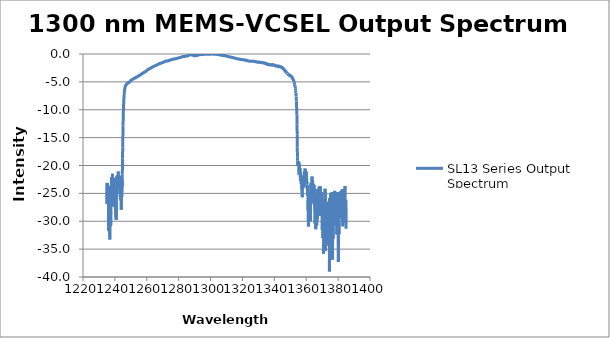
| Category | SL13 Series Output Spectrum |
|---|---|
| 1235.017822 | -23.178 |
| 1235.092651 | -26.92 |
| 1235.167358 | -23.479 |
| 1235.242065 | -23.117 |
| 1235.316772 | -26.883 |
| 1235.391602 | -23.198 |
| 1235.466309 | -24.905 |
| 1235.541138 | -24.521 |
| 1235.615967 | -25.759 |
| 1235.690796 | -24.317 |
| 1235.765625 | -24.794 |
| 1235.840454 | -24.998 |
| 1235.915283 | -25.098 |
| 1235.990112 | -25.63 |
| 1236.064941 | -31.709 |
| 1236.139771 | -23.677 |
| 1236.2146 | -27.805 |
| 1236.289429 | -25.815 |
| 1236.36438 | -25.772 |
| 1236.439209 | -25.107 |
| 1236.51416 | -25.187 |
| 1236.588989 | -23.827 |
| 1236.66394 | -25.55 |
| 1236.738892 | -25.992 |
| 1236.813843 | -33.268 |
| 1236.888794 | -25.245 |
| 1236.963745 | -24.883 |
| 1237.038696 | -27.538 |
| 1237.113647 | -23.63 |
| 1237.188721 | -29.483 |
| 1237.263672 | -30.914 |
| 1237.338623 | -26.489 |
| 1237.413696 | -30.67 |
| 1237.488647 | -25.498 |
| 1237.563721 | -27.207 |
| 1237.638794 | -26.888 |
| 1237.713745 | -27.307 |
| 1237.788818 | -25.378 |
| 1237.863892 | -25.714 |
| 1237.938965 | -22.08 |
| 1238.014038 | -25.544 |
| 1238.089111 | -26.344 |
| 1238.164185 | -25.006 |
| 1238.23938 | -22.156 |
| 1238.314453 | -24.307 |
| 1238.389526 | -23.302 |
| 1238.464722 | -24.922 |
| 1238.539795 | -21.475 |
| 1238.61499 | -24.49 |
| 1238.690186 | -23.038 |
| 1238.765381 | -22.666 |
| 1238.840576 | -24.753 |
| 1238.915771 | -23.71 |
| 1238.990967 | -25.703 |
| 1239.066162 | -22.613 |
| 1239.141357 | -22.245 |
| 1239.216553 | -27.415 |
| 1239.29187 | -26.958 |
| 1239.367065 | -23.717 |
| 1239.442261 | -26.08 |
| 1239.517578 | -25.221 |
| 1239.592896 | -24.454 |
| 1239.668091 | -24.895 |
| 1239.743408 | -25.11 |
| 1239.818726 | -25.185 |
| 1239.894043 | -26.1 |
| 1239.96936 | -24.505 |
| 1240.044678 | -25.858 |
| 1240.119995 | -24.098 |
| 1240.195313 | -25.616 |
| 1240.27063 | -23.873 |
| 1240.346069 | -27.184 |
| 1240.421509 | -28.304 |
| 1240.496826 | -25.278 |
| 1240.572266 | -25.849 |
| 1240.647705 | -29.289 |
| 1240.723022 | -23.726 |
| 1240.798462 | -29.763 |
| 1240.873901 | -23.878 |
| 1240.949341 | -25.069 |
| 1241.02478 | -24.898 |
| 1241.10022 | -24.834 |
| 1241.175659 | -21.917 |
| 1241.251221 | -25.121 |
| 1241.32666 | -23.162 |
| 1241.4021 | -23.84 |
| 1241.477661 | -22.129 |
| 1241.553101 | -23.209 |
| 1241.628662 | -23.309 |
| 1241.704224 | -22.901 |
| 1241.779663 | -22.162 |
| 1241.855225 | -21.719 |
| 1241.930908 | -21.714 |
| 1242.00647 | -24.059 |
| 1242.082031 | -21.068 |
| 1242.157593 | -21.642 |
| 1242.233154 | -22.555 |
| 1242.308838 | -22.256 |
| 1242.384399 | -21.975 |
| 1242.459961 | -23.236 |
| 1242.535645 | -22.601 |
| 1242.611328 | -22.903 |
| 1242.68689 | -24.285 |
| 1242.762573 | -23.297 |
| 1242.838257 | -21.834 |
| 1242.91394 | -23.138 |
| 1242.989624 | -23.001 |
| 1243.065308 | -23.47 |
| 1243.140991 | -24.163 |
| 1243.216675 | -23.33 |
| 1243.29248 | -22.642 |
| 1243.368164 | -25.693 |
| 1243.44397 | -24.565 |
| 1243.519653 | -23.768 |
| 1243.595459 | -23.18 |
| 1243.671265 | -24.682 |
| 1243.746948 | -26.228 |
| 1243.822754 | -24.622 |
| 1243.89856 | -24.351 |
| 1243.974365 | -27.939 |
| 1244.050171 | -24.407 |
| 1244.125977 | -24.814 |
| 1244.201904 | -24.524 |
| 1244.27771 | -22.801 |
| 1244.353516 | -25.668 |
| 1244.429443 | -23.31 |
| 1244.505249 | -22.739 |
| 1244.581177 | -23.643 |
| 1244.656982 | -21.614 |
| 1244.73291 | -20.265 |
| 1244.808838 | -18.7 |
| 1244.884766 | -16.748 |
| 1244.960693 | -15.62 |
| 1245.036621 | -14.154 |
| 1245.112549 | -12.785 |
| 1245.188599 | -11.843 |
| 1245.264526 | -10.874 |
| 1245.340454 | -10.115 |
| 1245.416504 | -9.482 |
| 1245.492432 | -8.901 |
| 1245.568481 | -8.468 |
| 1245.644409 | -8.011 |
| 1245.720459 | -7.636 |
| 1245.796509 | -7.364 |
| 1245.872559 | -7.061 |
| 1245.948608 | -6.841 |
| 1246.024658 | -6.607 |
| 1246.100708 | -6.442 |
| 1246.176758 | -6.315 |
| 1246.252808 | -6.147 |
| 1246.328979 | -6.063 |
| 1246.405029 | -5.945 |
| 1246.481079 | -5.882 |
| 1246.557251 | -5.786 |
| 1246.633423 | -5.77 |
| 1246.709595 | -5.658 |
| 1246.785767 | -5.636 |
| 1246.861938 | -5.591 |
| 1246.937988 | -5.575 |
| 1247.014282 | -5.588 |
| 1247.090454 | -5.556 |
| 1247.166626 | -5.474 |
| 1247.242798 | -5.465 |
| 1247.31897 | -5.416 |
| 1247.395264 | -5.447 |
| 1247.471436 | -5.332 |
| 1247.547729 | -5.315 |
| 1247.623901 | -5.32 |
| 1247.700195 | -5.256 |
| 1247.776489 | -5.276 |
| 1247.852783 | -5.245 |
| 1247.929077 | -5.193 |
| 1248.005371 | -5.249 |
| 1248.081665 | -5.161 |
| 1248.157959 | -5.198 |
| 1248.234375 | -5.17 |
| 1248.310669 | -5.2 |
| 1248.386963 | -5.191 |
| 1248.463379 | -5.163 |
| 1248.539673 | -5.172 |
| 1248.616089 | -5.167 |
| 1248.692505 | -5.151 |
| 1248.768799 | -5.171 |
| 1248.845215 | -5.118 |
| 1248.921631 | -5.114 |
| 1248.998047 | -5.066 |
| 1249.074463 | -5.076 |
| 1249.150879 | -5.024 |
| 1249.227417 | -5.021 |
| 1249.303833 | -4.966 |
| 1249.380249 | -4.931 |
| 1249.456787 | -4.943 |
| 1249.533203 | -4.909 |
| 1249.609741 | -4.856 |
| 1249.686279 | -4.853 |
| 1249.762695 | -4.793 |
| 1249.839355 | -4.789 |
| 1249.915894 | -4.726 |
| 1249.992432 | -4.739 |
| 1250.06897 | -4.737 |
| 1250.145508 | -4.714 |
| 1250.222046 | -4.744 |
| 1250.298706 | -4.703 |
| 1250.375244 | -4.729 |
| 1250.451782 | -4.702 |
| 1250.528442 | -4.665 |
| 1250.605103 | -4.654 |
| 1250.681641 | -4.61 |
| 1250.758301 | -4.626 |
| 1250.834961 | -4.591 |
| 1250.911621 | -4.554 |
| 1250.988281 | -4.575 |
| 1251.064941 | -4.55 |
| 1251.141602 | -4.555 |
| 1251.218262 | -4.496 |
| 1251.294922 | -4.487 |
| 1251.371704 | -4.471 |
| 1251.448486 | -4.445 |
| 1251.525146 | -4.437 |
| 1251.601929 | -4.421 |
| 1251.678711 | -4.414 |
| 1251.755493 | -4.42 |
| 1251.832153 | -4.38 |
| 1251.908936 | -4.407 |
| 1251.985718 | -4.39 |
| 1252.0625 | -4.389 |
| 1252.139282 | -4.362 |
| 1252.216187 | -4.349 |
| 1252.292969 | -4.37 |
| 1252.369751 | -4.333 |
| 1252.446655 | -4.359 |
| 1252.523438 | -4.325 |
| 1252.600342 | -4.302 |
| 1252.677246 | -4.321 |
| 1252.754028 | -4.264 |
| 1252.830933 | -4.292 |
| 1252.907837 | -4.251 |
| 1252.984863 | -4.226 |
| 1253.061768 | -4.197 |
| 1253.138672 | -4.174 |
| 1253.215576 | -4.191 |
| 1253.292603 | -4.146 |
| 1253.369507 | -4.155 |
| 1253.446411 | -4.185 |
| 1253.523438 | -4.135 |
| 1253.600464 | -4.156 |
| 1253.677368 | -4.123 |
| 1253.754395 | -4.128 |
| 1253.831421 | -4.11 |
| 1253.908447 | -4.088 |
| 1253.985474 | -4.095 |
| 1254.0625 | -4.064 |
| 1254.139526 | -4.066 |
| 1254.216553 | -4.074 |
| 1254.293701 | -4.035 |
| 1254.370728 | -4.057 |
| 1254.447876 | -4.036 |
| 1254.524902 | -4.001 |
| 1254.602051 | -3.956 |
| 1254.679199 | -3.972 |
| 1254.756348 | -3.928 |
| 1254.833496 | -3.92 |
| 1254.910645 | -3.918 |
| 1254.987793 | -3.882 |
| 1255.064941 | -3.894 |
| 1255.14209 | -3.895 |
| 1255.219238 | -3.838 |
| 1255.296509 | -3.883 |
| 1255.373657 | -3.817 |
| 1255.450806 | -3.837 |
| 1255.528076 | -3.807 |
| 1255.605347 | -3.796 |
| 1255.682495 | -3.81 |
| 1255.759766 | -3.787 |
| 1255.837036 | -3.791 |
| 1255.914307 | -3.79 |
| 1255.991577 | -3.739 |
| 1256.068848 | -3.758 |
| 1256.146118 | -3.721 |
| 1256.223511 | -3.72 |
| 1256.300781 | -3.686 |
| 1256.378174 | -3.647 |
| 1256.455444 | -3.628 |
| 1256.532837 | -3.626 |
| 1256.610229 | -3.618 |
| 1256.6875 | -3.582 |
| 1256.764893 | -3.586 |
| 1256.842285 | -3.581 |
| 1256.919678 | -3.553 |
| 1256.99707 | -3.526 |
| 1257.074463 | -3.496 |
| 1257.151855 | -3.495 |
| 1257.22937 | -3.48 |
| 1257.306763 | -3.465 |
| 1257.384155 | -3.478 |
| 1257.46167 | -3.447 |
| 1257.539185 | -3.467 |
| 1257.616577 | -3.429 |
| 1257.694092 | -3.407 |
| 1257.771606 | -3.415 |
| 1257.849121 | -3.373 |
| 1257.926636 | -3.376 |
| 1258.00415 | -3.329 |
| 1258.081665 | -3.334 |
| 1258.159302 | -3.349 |
| 1258.236816 | -3.306 |
| 1258.314331 | -3.316 |
| 1258.391968 | -3.272 |
| 1258.469482 | -3.279 |
| 1258.547119 | -3.264 |
| 1258.624756 | -3.247 |
| 1258.702271 | -3.239 |
| 1258.779907 | -3.201 |
| 1258.857544 | -3.174 |
| 1258.935181 | -3.187 |
| 1259.012817 | -3.168 |
| 1259.090454 | -3.197 |
| 1259.168213 | -3.146 |
| 1259.24585 | -3.16 |
| 1259.323486 | -3.14 |
| 1259.401245 | -3.13 |
| 1259.479004 | -3.096 |
| 1259.556763 | -3.067 |
| 1259.634399 | -3.057 |
| 1259.712158 | -3.032 |
| 1259.789917 | -3.007 |
| 1259.867676 | -3.01 |
| 1259.945435 | -2.967 |
| 1260.023193 | -2.971 |
| 1260.100952 | -2.926 |
| 1260.178711 | -2.917 |
| 1260.256592 | -2.894 |
| 1260.334351 | -2.882 |
| 1260.412231 | -2.856 |
| 1260.48999 | -2.828 |
| 1260.567871 | -2.835 |
| 1260.645752 | -2.816 |
| 1260.723511 | -2.798 |
| 1260.801392 | -2.825 |
| 1260.879272 | -2.782 |
| 1260.957153 | -2.778 |
| 1261.035156 | -2.732 |
| 1261.113037 | -2.717 |
| 1261.19104 | -2.708 |
| 1261.268921 | -2.686 |
| 1261.346802 | -2.696 |
| 1261.424805 | -2.662 |
| 1261.502686 | -2.668 |
| 1261.580688 | -2.687 |
| 1261.658691 | -2.626 |
| 1261.736694 | -2.656 |
| 1261.814697 | -2.611 |
| 1261.8927 | -2.599 |
| 1261.970703 | -2.596 |
| 1262.048706 | -2.577 |
| 1262.126709 | -2.561 |
| 1262.204712 | -2.552 |
| 1262.282837 | -2.555 |
| 1262.36084 | -2.544 |
| 1262.438965 | -2.53 |
| 1262.516968 | -2.515 |
| 1262.595093 | -2.499 |
| 1262.673218 | -2.513 |
| 1262.751343 | -2.473 |
| 1262.829468 | -2.464 |
| 1262.907593 | -2.446 |
| 1262.985718 | -2.426 |
| 1263.063965 | -2.447 |
| 1263.14209 | -2.409 |
| 1263.220215 | -2.419 |
| 1263.298462 | -2.423 |
| 1263.376587 | -2.389 |
| 1263.454834 | -2.389 |
| 1263.532959 | -2.335 |
| 1263.611206 | -2.348 |
| 1263.689453 | -2.341 |
| 1263.7677 | -2.314 |
| 1263.845947 | -2.301 |
| 1263.924194 | -2.272 |
| 1264.002441 | -2.297 |
| 1264.080688 | -2.275 |
| 1264.158936 | -2.261 |
| 1264.237305 | -2.251 |
| 1264.315674 | -2.22 |
| 1264.393921 | -2.22 |
| 1264.47229 | -2.195 |
| 1264.550659 | -2.179 |
| 1264.628906 | -2.18 |
| 1264.707275 | -2.169 |
| 1264.785645 | -2.167 |
| 1264.864014 | -2.167 |
| 1264.942383 | -2.166 |
| 1265.020752 | -2.135 |
| 1265.099243 | -2.129 |
| 1265.177612 | -2.107 |
| 1265.255981 | -2.093 |
| 1265.334473 | -2.091 |
| 1265.412842 | -2.067 |
| 1265.491333 | -2.059 |
| 1265.569824 | -2.079 |
| 1265.648315 | -2.034 |
| 1265.726685 | -2.062 |
| 1265.805176 | -2.028 |
| 1265.883789 | -2.007 |
| 1265.96228 | -1.997 |
| 1266.040771 | -1.981 |
| 1266.119385 | -1.991 |
| 1266.197876 | -1.982 |
| 1266.276367 | -1.969 |
| 1266.35498 | -1.97 |
| 1266.433594 | -1.948 |
| 1266.512085 | -1.961 |
| 1266.590698 | -1.943 |
| 1266.669312 | -1.935 |
| 1266.747925 | -1.907 |
| 1266.826538 | -1.907 |
| 1266.905151 | -1.88 |
| 1266.983765 | -1.859 |
| 1267.062378 | -1.86 |
| 1267.141113 | -1.842 |
| 1267.219727 | -1.828 |
| 1267.29834 | -1.843 |
| 1267.377075 | -1.804 |
| 1267.455811 | -1.817 |
| 1267.534546 | -1.783 |
| 1267.613281 | -1.764 |
| 1267.692017 | -1.751 |
| 1267.770752 | -1.747 |
| 1267.849487 | -1.743 |
| 1267.928223 | -1.721 |
| 1268.006958 | -1.722 |
| 1268.085693 | -1.722 |
| 1268.164551 | -1.714 |
| 1268.243286 | -1.726 |
| 1268.322021 | -1.691 |
| 1268.400879 | -1.711 |
| 1268.479736 | -1.675 |
| 1268.558594 | -1.669 |
| 1268.637329 | -1.664 |
| 1268.716187 | -1.66 |
| 1268.795044 | -1.669 |
| 1268.873901 | -1.643 |
| 1268.952881 | -1.632 |
| 1269.031738 | -1.628 |
| 1269.110596 | -1.611 |
| 1269.189575 | -1.609 |
| 1269.268555 | -1.588 |
| 1269.347412 | -1.58 |
| 1269.426392 | -1.564 |
| 1269.505371 | -1.563 |
| 1269.584229 | -1.583 |
| 1269.663208 | -1.568 |
| 1269.742188 | -1.572 |
| 1269.821167 | -1.549 |
| 1269.900146 | -1.537 |
| 1269.979248 | -1.543 |
| 1270.058228 | -1.517 |
| 1270.137207 | -1.521 |
| 1270.216309 | -1.496 |
| 1270.295288 | -1.487 |
| 1270.37439 | -1.468 |
| 1270.453369 | -1.454 |
| 1270.532471 | -1.467 |
| 1270.611572 | -1.451 |
| 1270.690674 | -1.451 |
| 1270.769775 | -1.413 |
| 1270.848999 | -1.412 |
| 1270.928101 | -1.409 |
| 1271.007202 | -1.374 |
| 1271.086426 | -1.381 |
| 1271.165527 | -1.361 |
| 1271.244629 | -1.355 |
| 1271.323853 | -1.38 |
| 1271.403076 | -1.339 |
| 1271.482178 | -1.351 |
| 1271.561401 | -1.34 |
| 1271.640625 | -1.33 |
| 1271.719849 | -1.323 |
| 1271.799072 | -1.301 |
| 1271.878296 | -1.304 |
| 1271.957642 | -1.298 |
| 1272.036865 | -1.284 |
| 1272.116089 | -1.313 |
| 1272.195435 | -1.273 |
| 1272.274658 | -1.28 |
| 1272.354004 | -1.256 |
| 1272.43335 | -1.273 |
| 1272.512695 | -1.252 |
| 1272.592041 | -1.25 |
| 1272.671387 | -1.228 |
| 1272.750732 | -1.239 |
| 1272.830078 | -1.243 |
| 1272.909424 | -1.242 |
| 1272.98877 | -1.233 |
| 1273.068237 | -1.25 |
| 1273.147583 | -1.232 |
| 1273.227051 | -1.248 |
| 1273.306396 | -1.218 |
| 1273.385864 | -1.233 |
| 1273.465332 | -1.216 |
| 1273.5448 | -1.209 |
| 1273.624268 | -1.212 |
| 1273.703735 | -1.187 |
| 1273.783203 | -1.198 |
| 1273.862671 | -1.198 |
| 1273.942139 | -1.146 |
| 1274.021606 | -1.173 |
| 1274.101196 | -1.146 |
| 1274.180786 | -1.156 |
| 1274.260376 | -1.14 |
| 1274.339844 | -1.126 |
| 1274.419434 | -1.117 |
| 1274.499023 | -1.101 |
| 1274.578613 | -1.107 |
| 1274.658203 | -1.098 |
| 1274.737793 | -1.093 |
| 1274.817383 | -1.088 |
| 1274.896973 | -1.066 |
| 1274.976563 | -1.075 |
| 1275.056274 | -1.052 |
| 1275.135864 | -1.049 |
| 1275.215576 | -1.025 |
| 1275.295166 | -1.02 |
| 1275.374878 | -1.019 |
| 1275.45459 | -1.002 |
| 1275.534302 | -1.002 |
| 1275.614014 | -0.994 |
| 1275.693726 | -0.977 |
| 1275.77356 | -0.976 |
| 1275.853271 | -0.959 |
| 1275.932983 | -0.958 |
| 1276.012695 | -0.963 |
| 1276.092529 | -0.936 |
| 1276.172241 | -0.964 |
| 1276.252075 | -0.931 |
| 1276.331909 | -0.953 |
| 1276.411743 | -0.936 |
| 1276.491455 | -0.941 |
| 1276.571289 | -0.942 |
| 1276.651123 | -0.932 |
| 1276.730957 | -0.928 |
| 1276.810913 | -0.922 |
| 1276.890747 | -0.92 |
| 1276.970581 | -0.92 |
| 1277.050537 | -0.891 |
| 1277.130371 | -0.901 |
| 1277.210327 | -0.892 |
| 1277.290283 | -0.902 |
| 1277.370117 | -0.877 |
| 1277.450195 | -0.87 |
| 1277.530151 | -0.868 |
| 1277.610107 | -0.853 |
| 1277.690063 | -0.868 |
| 1277.77002 | -0.857 |
| 1277.849976 | -0.844 |
| 1277.930054 | -0.856 |
| 1278.01001 | -0.832 |
| 1278.089966 | -0.854 |
| 1278.170044 | -0.841 |
| 1278.250122 | -0.844 |
| 1278.330078 | -0.823 |
| 1278.410156 | -0.812 |
| 1278.490234 | -0.817 |
| 1278.570313 | -0.794 |
| 1278.650391 | -0.803 |
| 1278.730469 | -0.791 |
| 1278.810669 | -0.775 |
| 1278.890747 | -0.793 |
| 1278.970825 | -0.762 |
| 1279.051025 | -0.79 |
| 1279.131226 | -0.768 |
| 1279.211426 | -0.766 |
| 1279.291504 | -0.754 |
| 1279.371704 | -0.741 |
| 1279.451904 | -0.749 |
| 1279.532104 | -0.74 |
| 1279.612305 | -0.719 |
| 1279.692505 | -0.738 |
| 1279.772827 | -0.718 |
| 1279.853027 | -0.724 |
| 1279.933228 | -0.71 |
| 1280.01355 | -0.701 |
| 1280.09375 | -0.706 |
| 1280.174072 | -0.69 |
| 1280.254395 | -0.696 |
| 1280.334595 | -0.672 |
| 1280.414917 | -0.669 |
| 1280.495239 | -0.666 |
| 1280.575562 | -0.64 |
| 1280.655884 | -0.658 |
| 1280.736328 | -0.638 |
| 1280.816772 | -0.64 |
| 1280.897095 | -0.623 |
| 1280.977417 | -0.617 |
| 1281.057861 | -0.608 |
| 1281.138306 | -0.597 |
| 1281.218628 | -0.604 |
| 1281.299072 | -0.582 |
| 1281.379517 | -0.581 |
| 1281.459961 | -0.581 |
| 1281.540405 | -0.565 |
| 1281.62085 | -0.577 |
| 1281.701294 | -0.552 |
| 1281.78186 | -0.549 |
| 1281.862305 | -0.537 |
| 1281.942749 | -0.512 |
| 1282.023315 | -0.519 |
| 1282.103882 | -0.501 |
| 1282.184326 | -0.498 |
| 1282.264893 | -0.508 |
| 1282.345459 | -0.489 |
| 1282.426147 | -0.501 |
| 1282.506714 | -0.468 |
| 1282.58728 | -0.485 |
| 1282.667847 | -0.478 |
| 1282.748413 | -0.467 |
| 1282.829102 | -0.469 |
| 1282.909668 | -0.445 |
| 1282.990356 | -0.457 |
| 1283.070923 | -0.449 |
| 1283.151611 | -0.454 |
| 1283.2323 | -0.45 |
| 1283.312988 | -0.449 |
| 1283.393677 | -0.45 |
| 1283.474365 | -0.43 |
| 1283.555054 | -0.439 |
| 1283.635742 | -0.43 |
| 1283.716431 | -0.428 |
| 1283.797241 | -0.428 |
| 1283.87793 | -0.414 |
| 1283.958618 | -0.423 |
| 1284.039429 | -0.422 |
| 1284.120239 | -0.414 |
| 1284.20105 | -0.427 |
| 1284.28186 | -0.409 |
| 1284.362671 | -0.42 |
| 1284.443481 | -0.399 |
| 1284.524292 | -0.392 |
| 1284.605103 | -0.412 |
| 1284.686035 | -0.386 |
| 1284.766846 | -0.397 |
| 1284.847656 | -0.381 |
| 1284.928589 | -0.387 |
| 1285.009521 | -0.395 |
| 1285.090332 | -0.383 |
| 1285.171265 | -0.369 |
| 1285.252197 | -0.349 |
| 1285.33313 | -0.346 |
| 1285.414063 | -0.338 |
| 1285.494995 | -0.322 |
| 1285.575928 | -0.334 |
| 1285.656982 | -0.31 |
| 1285.738037 | -0.31 |
| 1285.81897 | -0.307 |
| 1285.900024 | -0.306 |
| 1285.980957 | -0.28 |
| 1286.062012 | -0.275 |
| 1286.143066 | -0.253 |
| 1286.224121 | -0.248 |
| 1286.305054 | -0.24 |
| 1286.38623 | -0.242 |
| 1286.467285 | -0.221 |
| 1286.54834 | -0.227 |
| 1286.629395 | -0.2 |
| 1286.710449 | -0.21 |
| 1286.791626 | -0.195 |
| 1286.872681 | -0.192 |
| 1286.953857 | -0.188 |
| 1287.035034 | -0.149 |
| 1287.116211 | -0.152 |
| 1287.197266 | -0.156 |
| 1287.278442 | -0.147 |
| 1287.359619 | -0.163 |
| 1287.440918 | -0.144 |
| 1287.522095 | -0.162 |
| 1287.603394 | -0.148 |
| 1287.68457 | -0.155 |
| 1287.765869 | -0.147 |
| 1287.847046 | -0.153 |
| 1287.928345 | -0.153 |
| 1288.009521 | -0.146 |
| 1288.09082 | -0.15 |
| 1288.172119 | -0.164 |
| 1288.253418 | -0.165 |
| 1288.334717 | -0.187 |
| 1288.416016 | -0.19 |
| 1288.497437 | -0.193 |
| 1288.578735 | -0.203 |
| 1288.660034 | -0.19 |
| 1288.741455 | -0.209 |
| 1288.822754 | -0.207 |
| 1288.904175 | -0.214 |
| 1288.985596 | -0.219 |
| 1289.066895 | -0.234 |
| 1289.148438 | -0.248 |
| 1289.229858 | -0.255 |
| 1289.311279 | -0.275 |
| 1289.3927 | -0.256 |
| 1289.474121 | -0.272 |
| 1289.555664 | -0.273 |
| 1289.637085 | -0.261 |
| 1289.718628 | -0.288 |
| 1289.800049 | -0.284 |
| 1289.881592 | -0.304 |
| 1289.963013 | -0.312 |
| 1290.044556 | -0.309 |
| 1290.126099 | -0.316 |
| 1290.207642 | -0.31 |
| 1290.289185 | -0.303 |
| 1290.370728 | -0.311 |
| 1290.452393 | -0.297 |
| 1290.533936 | -0.305 |
| 1290.615479 | -0.287 |
| 1290.697144 | -0.302 |
| 1290.778687 | -0.304 |
| 1290.860474 | -0.312 |
| 1290.942139 | -0.302 |
| 1291.023682 | -0.293 |
| 1291.105347 | -0.301 |
| 1291.187012 | -0.278 |
| 1291.268677 | -0.265 |
| 1291.350464 | -0.274 |
| 1291.432129 | -0.24 |
| 1291.513794 | -0.264 |
| 1291.595581 | -0.241 |
| 1291.677246 | -0.246 |
| 1291.759033 | -0.238 |
| 1291.840698 | -0.243 |
| 1291.922485 | -0.224 |
| 1292.004272 | -0.217 |
| 1292.08606 | -0.206 |
| 1292.167847 | -0.184 |
| 1292.249634 | -0.172 |
| 1292.331421 | -0.181 |
| 1292.413208 | -0.16 |
| 1292.495117 | -0.171 |
| 1292.577026 | -0.163 |
| 1292.658813 | -0.153 |
| 1292.740723 | -0.149 |
| 1292.822632 | -0.129 |
| 1292.904541 | -0.135 |
| 1292.986328 | -0.12 |
| 1293.068237 | -0.115 |
| 1293.150146 | -0.112 |
| 1293.232056 | -0.097 |
| 1293.314087 | -0.125 |
| 1293.395996 | -0.112 |
| 1293.477905 | -0.115 |
| 1293.559937 | -0.096 |
| 1293.641846 | -0.096 |
| 1293.723877 | -0.099 |
| 1293.805908 | -0.073 |
| 1293.887939 | -0.086 |
| 1293.969849 | -0.074 |
| 1294.05188 | -0.081 |
| 1294.133911 | -0.092 |
| 1294.216064 | -0.085 |
| 1294.298096 | -0.087 |
| 1294.380249 | -0.089 |
| 1294.46228 | -0.079 |
| 1294.544434 | -0.084 |
| 1294.626465 | -0.078 |
| 1294.708618 | -0.082 |
| 1294.790771 | -0.064 |
| 1294.872803 | -0.073 |
| 1294.954956 | -0.064 |
| 1295.037109 | -0.072 |
| 1295.119263 | -0.089 |
| 1295.201538 | -0.064 |
| 1295.283691 | -0.071 |
| 1295.365845 | -0.068 |
| 1295.44812 | -0.05 |
| 1295.530273 | -0.074 |
| 1295.612549 | -0.04 |
| 1295.694702 | -0.052 |
| 1295.776978 | -0.043 |
| 1295.859253 | -0.051 |
| 1295.94165 | -0.061 |
| 1296.023926 | -0.062 |
| 1296.106201 | -0.06 |
| 1296.188477 | -0.051 |
| 1296.270752 | -0.047 |
| 1296.353149 | -0.042 |
| 1296.435425 | -0.03 |
| 1296.517822 | -0.037 |
| 1296.600098 | -0.042 |
| 1296.682495 | -0.047 |
| 1296.764893 | -0.046 |
| 1296.84729 | -0.043 |
| 1296.929688 | -0.051 |
| 1297.012085 | -0.046 |
| 1297.094482 | -0.046 |
| 1297.17688 | -0.037 |
| 1297.259277 | -0.032 |
| 1297.341797 | -0.046 |
| 1297.424194 | -0.028 |
| 1297.506714 | -0.053 |
| 1297.589233 | -0.04 |
| 1297.671753 | -0.051 |
| 1297.754272 | -0.053 |
| 1297.836792 | -0.045 |
| 1297.919312 | -0.067 |
| 1298.001831 | -0.038 |
| 1298.084351 | -0.046 |
| 1298.16687 | -0.051 |
| 1298.24939 | -0.041 |
| 1298.332031 | -0.063 |
| 1298.414551 | -0.05 |
| 1298.497192 | -0.045 |
| 1298.579834 | -0.05 |
| 1298.662354 | -0.049 |
| 1298.744995 | -0.05 |
| 1298.827637 | -0.048 |
| 1298.910278 | -0.046 |
| 1298.99292 | -0.03 |
| 1299.075562 | -0.03 |
| 1299.158325 | -0.045 |
| 1299.240967 | -0.027 |
| 1299.32373 | -0.044 |
| 1299.406494 | -0.035 |
| 1299.489136 | -0.031 |
| 1299.571899 | -0.043 |
| 1299.654663 | -0.031 |
| 1299.737427 | -0.041 |
| 1299.82019 | -0.021 |
| 1299.902954 | -0.021 |
| 1299.985718 | -0.014 |
| 1300.068481 | -0.011 |
| 1300.151367 | -0.029 |
| 1300.234131 | -0.01 |
| 1300.316895 | -0.032 |
| 1300.39978 | -0.014 |
| 1300.482666 | -0.017 |
| 1300.56543 | -0.016 |
| 1300.648315 | 0 |
| 1300.731201 | -0.012 |
| 1300.814087 | -0.009 |
| 1300.896973 | -0.009 |
| 1300.97998 | -0.018 |
| 1301.062988 | -0.001 |
| 1301.145874 | -0.01 |
| 1301.22876 | -0.014 |
| 1301.311768 | -0.022 |
| 1301.394653 | -0.023 |
| 1301.477661 | -0.003 |
| 1301.560669 | -0.018 |
| 1301.643677 | -0.016 |
| 1301.726685 | -0.034 |
| 1301.809692 | -0.034 |
| 1301.8927 | -0.025 |
| 1301.975708 | -0.042 |
| 1302.058838 | -0.022 |
| 1302.141846 | -0.05 |
| 1302.224854 | -0.04 |
| 1302.307983 | -0.033 |
| 1302.391113 | -0.047 |
| 1302.474121 | -0.032 |
| 1302.557251 | -0.049 |
| 1302.640381 | -0.053 |
| 1302.723511 | -0.054 |
| 1302.806763 | -0.048 |
| 1302.889893 | -0.054 |
| 1302.973022 | -0.058 |
| 1303.056274 | -0.06 |
| 1303.139404 | -0.072 |
| 1303.222656 | -0.063 |
| 1303.305786 | -0.054 |
| 1303.389038 | -0.069 |
| 1303.47229 | -0.045 |
| 1303.555542 | -0.065 |
| 1303.638794 | -0.063 |
| 1303.722046 | -0.051 |
| 1303.805298 | -0.065 |
| 1303.88855 | -0.055 |
| 1303.971802 | -0.075 |
| 1304.055176 | -0.066 |
| 1304.138428 | -0.059 |
| 1304.221802 | -0.084 |
| 1304.305176 | -0.054 |
| 1304.388428 | -0.074 |
| 1304.471924 | -0.063 |
| 1304.555298 | -0.08 |
| 1304.638672 | -0.078 |
| 1304.722046 | -0.075 |
| 1304.80542 | -0.077 |
| 1304.888794 | -0.085 |
| 1304.97229 | -0.098 |
| 1305.055664 | -0.103 |
| 1305.13916 | -0.09 |
| 1305.222534 | -0.122 |
| 1305.30603 | -0.109 |
| 1305.389526 | -0.108 |
| 1305.473022 | -0.115 |
| 1305.556519 | -0.121 |
| 1305.640015 | -0.132 |
| 1305.723511 | -0.138 |
| 1305.807007 | -0.146 |
| 1305.890503 | -0.155 |
| 1305.974121 | -0.165 |
| 1306.057617 | -0.175 |
| 1306.141235 | -0.15 |
| 1306.224854 | -0.189 |
| 1306.308472 | -0.174 |
| 1306.39209 | -0.197 |
| 1306.475708 | -0.2 |
| 1306.559326 | -0.202 |
| 1306.642944 | -0.228 |
| 1306.726563 | -0.217 |
| 1306.810181 | -0.237 |
| 1306.893921 | -0.244 |
| 1306.977539 | -0.22 |
| 1307.061279 | -0.241 |
| 1307.144897 | -0.233 |
| 1307.228638 | -0.246 |
| 1307.312378 | -0.259 |
| 1307.396118 | -0.255 |
| 1307.479858 | -0.26 |
| 1307.563599 | -0.264 |
| 1307.647339 | -0.269 |
| 1307.731079 | -0.273 |
| 1307.814941 | -0.272 |
| 1307.898682 | -0.273 |
| 1307.982544 | -0.261 |
| 1308.066406 | -0.271 |
| 1308.150269 | -0.262 |
| 1308.234009 | -0.288 |
| 1308.317871 | -0.292 |
| 1308.401733 | -0.278 |
| 1308.485596 | -0.314 |
| 1308.569458 | -0.278 |
| 1308.653442 | -0.306 |
| 1308.737305 | -0.288 |
| 1308.821167 | -0.293 |
| 1308.905151 | -0.302 |
| 1308.989014 | -0.297 |
| 1309.072998 | -0.31 |
| 1309.156982 | -0.3 |
| 1309.240967 | -0.317 |
| 1309.324951 | -0.358 |
| 1309.408936 | -0.33 |
| 1309.49292 | -0.354 |
| 1309.576904 | -0.335 |
| 1309.661011 | -0.345 |
| 1309.744995 | -0.346 |
| 1309.829102 | -0.353 |
| 1309.913086 | -0.359 |
| 1309.997192 | -0.365 |
| 1310.081299 | -0.382 |
| 1310.165283 | -0.404 |
| 1310.24939 | -0.401 |
| 1310.333496 | -0.421 |
| 1310.417603 | -0.402 |
| 1310.501709 | -0.421 |
| 1310.585815 | -0.421 |
| 1310.669922 | -0.419 |
| 1310.75415 | -0.426 |
| 1310.838257 | -0.433 |
| 1310.922485 | -0.466 |
| 1311.006714 | -0.454 |
| 1311.090942 | -0.469 |
| 1311.175049 | -0.479 |
| 1311.259277 | -0.467 |
| 1311.343506 | -0.49 |
| 1311.427856 | -0.467 |
| 1311.512085 | -0.489 |
| 1311.596436 | -0.501 |
| 1311.680664 | -0.497 |
| 1311.765015 | -0.508 |
| 1311.849243 | -0.506 |
| 1311.933594 | -0.532 |
| 1312.017944 | -0.538 |
| 1312.102295 | -0.532 |
| 1312.186523 | -0.546 |
| 1312.270874 | -0.522 |
| 1312.355347 | -0.536 |
| 1312.439697 | -0.53 |
| 1312.524048 | -0.534 |
| 1312.608398 | -0.56 |
| 1312.692871 | -0.547 |
| 1312.777344 | -0.58 |
| 1312.861694 | -0.572 |
| 1312.946167 | -0.586 |
| 1313.03064 | -0.592 |
| 1313.115112 | -0.569 |
| 1313.199585 | -0.603 |
| 1313.284058 | -0.573 |
| 1313.368652 | -0.596 |
| 1313.453125 | -0.596 |
| 1313.537598 | -0.595 |
| 1313.622192 | -0.63 |
| 1313.706665 | -0.626 |
| 1313.79126 | -0.638 |
| 1313.875854 | -0.637 |
| 1313.960327 | -0.639 |
| 1314.044922 | -0.643 |
| 1314.129517 | -0.637 |
| 1314.214111 | -0.648 |
| 1314.298828 | -0.646 |
| 1314.383423 | -0.666 |
| 1314.468018 | -0.689 |
| 1314.552734 | -0.679 |
| 1314.637329 | -0.709 |
| 1314.722046 | -0.694 |
| 1314.806641 | -0.704 |
| 1314.891479 | -0.716 |
| 1314.976196 | -0.704 |
| 1315.060913 | -0.733 |
| 1315.14563 | -0.705 |
| 1315.230347 | -0.743 |
| 1315.315063 | -0.762 |
| 1315.39978 | -0.755 |
| 1315.484619 | -0.786 |
| 1315.569336 | -0.75 |
| 1315.654175 | -0.782 |
| 1315.739014 | -0.779 |
| 1315.82373 | -0.771 |
| 1315.908569 | -0.788 |
| 1315.993408 | -0.779 |
| 1316.078247 | -0.792 |
| 1316.163086 | -0.796 |
| 1316.248047 | -0.807 |
| 1316.332886 | -0.844 |
| 1316.417725 | -0.828 |
| 1316.502686 | -0.852 |
| 1316.587524 | -0.841 |
| 1316.672607 | -0.839 |
| 1316.757568 | -0.843 |
| 1316.842407 | -0.841 |
| 1316.927368 | -0.85 |
| 1317.012329 | -0.847 |
| 1317.09729 | -0.881 |
| 1317.182373 | -0.877 |
| 1317.267334 | -0.879 |
| 1317.352295 | -0.915 |
| 1317.437378 | -0.878 |
| 1317.522339 | -0.912 |
| 1317.607422 | -0.88 |
| 1317.692505 | -0.879 |
| 1317.777588 | -0.901 |
| 1317.862671 | -0.895 |
| 1317.947754 | -0.927 |
| 1318.032837 | -0.926 |
| 1318.11792 | -0.921 |
| 1318.203003 | -0.948 |
| 1318.288208 | -0.926 |
| 1318.373291 | -0.962 |
| 1318.458496 | -0.941 |
| 1318.543701 | -0.943 |
| 1318.628906 | -0.954 |
| 1318.714111 | -0.953 |
| 1318.799194 | -0.975 |
| 1318.884399 | -0.971 |
| 1318.969727 | -0.989 |
| 1319.054932 | -1.001 |
| 1319.140137 | -0.983 |
| 1319.225342 | -1.007 |
| 1319.310669 | -0.97 |
| 1319.395874 | -1.005 |
| 1319.481201 | -0.984 |
| 1319.566528 | -0.982 |
| 1319.651855 | -1.004 |
| 1319.737183 | -1.001 |
| 1319.82251 | -1.038 |
| 1319.907837 | -1.014 |
| 1319.993164 | -1.021 |
| 1320.078491 | -1.035 |
| 1320.16394 | -1.017 |
| 1320.24939 | -1.047 |
| 1320.334717 | -1.011 |
| 1320.420166 | -1.029 |
| 1320.505493 | -1.028 |
| 1320.590942 | -1.022 |
| 1320.676392 | -1.062 |
| 1320.761841 | -1.046 |
| 1320.84729 | -1.066 |
| 1320.932739 | -1.062 |
| 1321.018311 | -1.051 |
| 1321.10376 | -1.073 |
| 1321.189331 | -1.049 |
| 1321.27478 | -1.06 |
| 1321.360352 | -1.058 |
| 1321.445801 | -1.06 |
| 1321.531372 | -1.098 |
| 1321.616943 | -1.068 |
| 1321.702515 | -1.119 |
| 1321.788086 | -1.098 |
| 1321.873657 | -1.1 |
| 1321.959351 | -1.1 |
| 1322.045044 | -1.082 |
| 1322.130615 | -1.124 |
| 1322.216309 | -1.117 |
| 1322.30188 | -1.131 |
| 1322.387573 | -1.143 |
| 1322.473267 | -1.125 |
| 1322.55896 | -1.172 |
| 1322.644653 | -1.146 |
| 1322.730347 | -1.175 |
| 1322.81604 | -1.181 |
| 1322.901733 | -1.164 |
| 1322.987549 | -1.186 |
| 1323.073242 | -1.179 |
| 1323.159058 | -1.206 |
| 1323.244751 | -1.204 |
| 1323.330566 | -1.199 |
| 1323.416382 | -1.241 |
| 1323.502197 | -1.211 |
| 1323.588013 | -1.267 |
| 1323.673828 | -1.24 |
| 1323.759766 | -1.261 |
| 1323.845581 | -1.261 |
| 1323.931396 | -1.258 |
| 1324.017334 | -1.276 |
| 1324.103149 | -1.261 |
| 1324.189087 | -1.284 |
| 1324.275024 | -1.291 |
| 1324.360962 | -1.276 |
| 1324.446777 | -1.32 |
| 1324.532715 | -1.274 |
| 1324.618774 | -1.31 |
| 1324.704712 | -1.296 |
| 1324.790649 | -1.284 |
| 1324.876587 | -1.311 |
| 1324.962646 | -1.29 |
| 1325.048584 | -1.298 |
| 1325.134644 | -1.303 |
| 1325.220703 | -1.298 |
| 1325.306763 | -1.315 |
| 1325.3927 | -1.293 |
| 1325.478882 | -1.309 |
| 1325.564941 | -1.296 |
| 1325.651001 | -1.295 |
| 1325.737183 | -1.292 |
| 1325.823242 | -1.282 |
| 1325.909424 | -1.311 |
| 1325.995483 | -1.271 |
| 1326.081665 | -1.298 |
| 1326.167847 | -1.297 |
| 1326.253906 | -1.281 |
| 1326.340088 | -1.304 |
| 1326.42627 | -1.264 |
| 1326.512451 | -1.301 |
| 1326.598755 | -1.299 |
| 1326.684937 | -1.288 |
| 1326.771118 | -1.311 |
| 1326.857422 | -1.277 |
| 1326.943604 | -1.3 |
| 1327.029907 | -1.282 |
| 1327.116211 | -1.292 |
| 1327.202515 | -1.321 |
| 1327.288818 | -1.302 |
| 1327.375122 | -1.336 |
| 1327.461426 | -1.331 |
| 1327.547852 | -1.333 |
| 1327.634155 | -1.36 |
| 1327.720459 | -1.326 |
| 1327.806885 | -1.366 |
| 1327.893188 | -1.336 |
| 1327.979614 | -1.354 |
| 1328.06604 | -1.371 |
| 1328.152466 | -1.36 |
| 1328.238892 | -1.377 |
| 1328.325317 | -1.376 |
| 1328.411743 | -1.395 |
| 1328.498169 | -1.392 |
| 1328.584595 | -1.396 |
| 1328.671143 | -1.407 |
| 1328.757568 | -1.384 |
| 1328.844116 | -1.447 |
| 1328.930542 | -1.408 |
| 1329.01709 | -1.429 |
| 1329.10376 | -1.433 |
| 1329.190308 | -1.415 |
| 1329.276855 | -1.465 |
| 1329.363403 | -1.441 |
| 1329.449951 | -1.443 |
| 1329.536499 | -1.458 |
| 1329.623169 | -1.421 |
| 1329.709717 | -1.459 |
| 1329.796387 | -1.435 |
| 1329.883057 | -1.453 |
| 1329.969604 | -1.472 |
| 1330.056274 | -1.462 |
| 1330.142944 | -1.485 |
| 1330.229614 | -1.463 |
| 1330.316406 | -1.493 |
| 1330.403076 | -1.474 |
| 1330.489746 | -1.477 |
| 1330.576538 | -1.489 |
| 1330.663208 | -1.446 |
| 1330.75 | -1.503 |
| 1330.836792 | -1.477 |
| 1330.923584 | -1.503 |
| 1331.010376 | -1.535 |
| 1331.097168 | -1.504 |
| 1331.18396 | -1.538 |
| 1331.270752 | -1.506 |
| 1331.357544 | -1.519 |
| 1331.444458 | -1.519 |
| 1331.53125 | -1.495 |
| 1331.618164 | -1.518 |
| 1331.704956 | -1.504 |
| 1331.79187 | -1.548 |
| 1331.878784 | -1.541 |
| 1331.965698 | -1.539 |
| 1332.052612 | -1.565 |
| 1332.139526 | -1.541 |
| 1332.22644 | -1.564 |
| 1332.313477 | -1.54 |
| 1332.400391 | -1.536 |
| 1332.487305 | -1.571 |
| 1332.574341 | -1.534 |
| 1332.661377 | -1.588 |
| 1332.748413 | -1.573 |
| 1332.835449 | -1.593 |
| 1332.922485 | -1.609 |
| 1333.009521 | -1.576 |
| 1333.096558 | -1.615 |
| 1333.183594 | -1.562 |
| 1333.270752 | -1.595 |
| 1333.357788 | -1.588 |
| 1333.444946 | -1.578 |
| 1333.531982 | -1.619 |
| 1333.619141 | -1.591 |
| 1333.706299 | -1.651 |
| 1333.793457 | -1.655 |
| 1333.880615 | -1.646 |
| 1333.967773 | -1.679 |
| 1334.054932 | -1.629 |
| 1334.14209 | -1.665 |
| 1334.229248 | -1.662 |
| 1334.316528 | -1.649 |
| 1334.403687 | -1.691 |
| 1334.491089 | -1.685 |
| 1334.578247 | -1.746 |
| 1334.665527 | -1.738 |
| 1334.752808 | -1.747 |
| 1334.840088 | -1.755 |
| 1334.927368 | -1.74 |
| 1335.014648 | -1.778 |
| 1335.102051 | -1.723 |
| 1335.189331 | -1.773 |
| 1335.276611 | -1.771 |
| 1335.364014 | -1.78 |
| 1335.451416 | -1.847 |
| 1335.538696 | -1.812 |
| 1335.626099 | -1.896 |
| 1335.713501 | -1.857 |
| 1335.800903 | -1.843 |
| 1335.888306 | -1.88 |
| 1335.97583 | -1.814 |
| 1336.063232 | -1.872 |
| 1336.150635 | -1.838 |
| 1336.238281 | -1.865 |
| 1336.325684 | -1.914 |
| 1336.413208 | -1.892 |
| 1336.500732 | -1.943 |
| 1336.588135 | -1.915 |
| 1336.675659 | -1.916 |
| 1336.763184 | -1.937 |
| 1336.85083 | -1.886 |
| 1336.938354 | -1.93 |
| 1337.025879 | -1.872 |
| 1337.113525 | -1.925 |
| 1337.20105 | -1.923 |
| 1337.288696 | -1.927 |
| 1337.376343 | -1.976 |
| 1337.463867 | -1.926 |
| 1337.551514 | -1.96 |
| 1337.63916 | -1.933 |
| 1337.726807 | -1.931 |
| 1337.814575 | -1.952 |
| 1337.902222 | -1.892 |
| 1337.989868 | -1.957 |
| 1338.077637 | -1.909 |
| 1338.165405 | -1.959 |
| 1338.253174 | -1.976 |
| 1338.34082 | -1.956 |
| 1338.428589 | -2.003 |
| 1338.516357 | -1.941 |
| 1338.604126 | -1.934 |
| 1338.691895 | -1.94 |
| 1338.779785 | -1.89 |
| 1338.867554 | -1.972 |
| 1338.955322 | -1.917 |
| 1339.043213 | -1.973 |
| 1339.130981 | -1.979 |
| 1339.218872 | -1.971 |
| 1339.306763 | -2.029 |
| 1339.394653 | -1.963 |
| 1339.482544 | -2.011 |
| 1339.570435 | -1.968 |
| 1339.658325 | -1.956 |
| 1339.746216 | -2.011 |
| 1339.834229 | -1.971 |
| 1339.922241 | -2.048 |
| 1340.010132 | -2.008 |
| 1340.098145 | -2.059 |
| 1340.186157 | -2.085 |
| 1340.27417 | -2.039 |
| 1340.362061 | -2.099 |
| 1340.450195 | -2.024 |
| 1340.538208 | -2.072 |
| 1340.626221 | -2.066 |
| 1340.714233 | -2.039 |
| 1340.802368 | -2.109 |
| 1340.890381 | -2.071 |
| 1340.978516 | -2.141 |
| 1341.066528 | -2.143 |
| 1341.154663 | -2.114 |
| 1341.242798 | -2.179 |
| 1341.330933 | -2.102 |
| 1341.419067 | -2.166 |
| 1341.507202 | -2.121 |
| 1341.595337 | -2.14 |
| 1341.683594 | -2.188 |
| 1341.771851 | -2.143 |
| 1341.859985 | -2.221 |
| 1341.948242 | -2.175 |
| 1342.036499 | -2.203 |
| 1342.124756 | -2.209 |
| 1342.213013 | -2.155 |
| 1342.30127 | -2.237 |
| 1342.389526 | -2.136 |
| 1342.477783 | -2.198 |
| 1342.56604 | -2.207 |
| 1342.654419 | -2.187 |
| 1342.742676 | -2.274 |
| 1342.831055 | -2.205 |
| 1342.919312 | -2.255 |
| 1343.00769 | -2.261 |
| 1343.096069 | -2.223 |
| 1343.184448 | -2.277 |
| 1343.272827 | -2.199 |
| 1343.361206 | -2.274 |
| 1343.449585 | -2.245 |
| 1343.538208 | -2.268 |
| 1343.626587 | -2.303 |
| 1343.714966 | -2.272 |
| 1343.803467 | -2.338 |
| 1343.891968 | -2.302 |
| 1343.980469 | -2.323 |
| 1344.06897 | -2.347 |
| 1344.157471 | -2.275 |
| 1344.245972 | -2.398 |
| 1344.334473 | -2.309 |
| 1344.422974 | -2.388 |
| 1344.511597 | -2.387 |
| 1344.600098 | -2.364 |
| 1344.688721 | -2.44 |
| 1344.777222 | -2.373 |
| 1344.865845 | -2.474 |
| 1344.954468 | -2.448 |
| 1345.043091 | -2.462 |
| 1345.131714 | -2.533 |
| 1345.220337 | -2.466 |
| 1345.309082 | -2.576 |
| 1345.397827 | -2.537 |
| 1345.48645 | -2.582 |
| 1345.575195 | -2.655 |
| 1345.663818 | -2.591 |
| 1345.752563 | -2.699 |
| 1345.841309 | -2.654 |
| 1345.930054 | -2.706 |
| 1346.018799 | -2.762 |
| 1346.107544 | -2.721 |
| 1346.196289 | -2.893 |
| 1346.285034 | -2.822 |
| 1346.373901 | -2.884 |
| 1346.462646 | -2.915 |
| 1346.551514 | -2.916 |
| 1346.640381 | -3.008 |
| 1346.729126 | -2.949 |
| 1346.817993 | -3.085 |
| 1346.90686 | -3.063 |
| 1346.995728 | -3.083 |
| 1347.084717 | -3.186 |
| 1347.173706 | -3.107 |
| 1347.262573 | -3.29 |
| 1347.35144 | -3.301 |
| 1347.44043 | -3.255 |
| 1347.529419 | -3.412 |
| 1347.618286 | -3.251 |
| 1347.707275 | -3.432 |
| 1347.796265 | -3.356 |
| 1347.885254 | -3.415 |
| 1347.974243 | -3.474 |
| 1348.063354 | -3.476 |
| 1348.152344 | -3.587 |
| 1348.241333 | -3.473 |
| 1348.330444 | -3.56 |
| 1348.419434 | -3.572 |
| 1348.508545 | -3.571 |
| 1348.597656 | -3.678 |
| 1348.686768 | -3.579 |
| 1348.775879 | -3.703 |
| 1348.86499 | -3.683 |
| 1348.954102 | -3.681 |
| 1349.043335 | -3.769 |
| 1349.132568 | -3.67 |
| 1349.22168 | -3.774 |
| 1349.310913 | -3.715 |
| 1349.400024 | -3.745 |
| 1349.489258 | -3.82 |
| 1349.578491 | -3.762 |
| 1349.667725 | -3.908 |
| 1349.756958 | -3.785 |
| 1349.846191 | -3.94 |
| 1349.935425 | -3.947 |
| 1350.02478 | -3.96 |
| 1350.114014 | -4.079 |
| 1350.203369 | -3.821 |
| 1350.292603 | -4.017 |
| 1350.381958 | -3.964 |
| 1350.471313 | -3.956 |
| 1350.560669 | -4.07 |
| 1350.650024 | -3.986 |
| 1350.73938 | -4.157 |
| 1350.828857 | -4.121 |
| 1350.918213 | -4.129 |
| 1351.00769 | -4.206 |
| 1351.097046 | -4.138 |
| 1351.186523 | -4.327 |
| 1351.276001 | -4.169 |
| 1351.365479 | -4.296 |
| 1351.454834 | -4.508 |
| 1351.544312 | -4.305 |
| 1351.633911 | -4.58 |
| 1351.723389 | -4.48 |
| 1351.812866 | -4.567 |
| 1351.902344 | -4.649 |
| 1351.991943 | -4.573 |
| 1352.081543 | -4.932 |
| 1352.171021 | -4.91 |
| 1352.26062 | -4.883 |
| 1352.35022 | -4.978 |
| 1352.439819 | -4.996 |
| 1352.529419 | -5.291 |
| 1352.619019 | -5.183 |
| 1352.70874 | -5.504 |
| 1352.79834 | -5.728 |
| 1352.888062 | -5.603 |
| 1352.977783 | -5.767 |
| 1353.067383 | -5.776 |
| 1353.157104 | -6.084 |
| 1353.246826 | -6.178 |
| 1353.336548 | -6.585 |
| 1353.42627 | -6.873 |
| 1353.515991 | -6.938 |
| 1353.605713 | -7.528 |
| 1353.695557 | -7.608 |
| 1353.785278 | -8.276 |
| 1353.875 | -8.566 |
| 1353.964844 | -9.34 |
| 1354.054688 | -10.258 |
| 1354.144531 | -10.898 |
| 1354.234375 | -12.597 |
| 1354.324219 | -14.395 |
| 1354.414063 | -16.71 |
| 1354.503906 | -18.529 |
| 1354.593872 | -19.135 |
| 1354.683716 | -19.591 |
| 1354.773682 | -20.04 |
| 1354.863647 | -19.326 |
| 1354.953491 | -19.67 |
| 1355.043457 | -19.728 |
| 1355.133423 | -19.257 |
| 1355.223389 | -19.489 |
| 1355.313354 | -19.811 |
| 1355.40332 | -19.438 |
| 1355.493408 | -21.613 |
| 1355.583374 | -19.773 |
| 1355.67334 | -20.345 |
| 1355.763428 | -20.039 |
| 1355.853516 | -21.364 |
| 1355.943604 | -20.929 |
| 1356.033569 | -20.925 |
| 1356.123657 | -20.466 |
| 1356.213745 | -21.984 |
| 1356.303955 | -22.116 |
| 1356.394165 | -22.707 |
| 1356.484253 | -21.105 |
| 1356.574341 | -22.221 |
| 1356.664551 | -22.144 |
| 1356.754761 | -22.5 |
| 1356.844849 | -23.305 |
| 1356.935059 | -23.349 |
| 1357.025269 | -22.03 |
| 1357.115479 | -22.872 |
| 1357.205811 | -22.489 |
| 1357.296021 | -24.336 |
| 1357.38623 | -23.856 |
| 1357.476563 | -25.693 |
| 1357.566772 | -23.052 |
| 1357.657104 | -23.35 |
| 1357.747437 | -22.683 |
| 1357.837646 | -22.705 |
| 1357.927979 | -22.693 |
| 1358.018311 | -24.052 |
| 1358.108765 | -22.665 |
| 1358.199097 | -21.815 |
| 1358.289551 | -22.529 |
| 1358.379883 | -23.391 |
| 1358.470337 | -22.544 |
| 1358.560669 | -23.879 |
| 1358.651123 | -22.415 |
| 1358.741577 | -22.103 |
| 1358.832031 | -21.703 |
| 1358.922485 | -21.197 |
| 1359.012939 | -21.007 |
| 1359.103394 | -23.189 |
| 1359.19397 | -21.205 |
| 1359.284424 | -20.543 |
| 1359.375 | -21.253 |
| 1359.465454 | -22.139 |
| 1359.55603 | -20.887 |
| 1359.646606 | -21.143 |
| 1359.737183 | -21.05 |
| 1359.827759 | -22.32 |
| 1359.918335 | -23.035 |
| 1360.008911 | -22.052 |
| 1360.099609 | -21.151 |
| 1360.190308 | -21.461 |
| 1360.280884 | -22.547 |
| 1360.371582 | -23.151 |
| 1360.462158 | -22.924 |
| 1360.552856 | -23.36 |
| 1360.643555 | -24.233 |
| 1360.734253 | -23.635 |
| 1360.824951 | -25.423 |
| 1360.915649 | -23.977 |
| 1361.00647 | -24.093 |
| 1361.097168 | -25.504 |
| 1361.187988 | -28.049 |
| 1361.278687 | -26.111 |
| 1361.369507 | -30.951 |
| 1361.460327 | -25.236 |
| 1361.551147 | -25.929 |
| 1361.641968 | -27.617 |
| 1361.732788 | -27.731 |
| 1361.823608 | -24.848 |
| 1361.914429 | -25.209 |
| 1362.005371 | -25.793 |
| 1362.096313 | -27.839 |
| 1362.187134 | -26.647 |
| 1362.278076 | -27.477 |
| 1362.369019 | -25.269 |
| 1362.459961 | -26.695 |
| 1362.550903 | -25.172 |
| 1362.641846 | -30.021 |
| 1362.732788 | -26.962 |
| 1362.82373 | -25.456 |
| 1362.914795 | -23.174 |
| 1363.005737 | -23.972 |
| 1363.096802 | -23.606 |
| 1363.187866 | -24.116 |
| 1363.278809 | -25.123 |
| 1363.369873 | -23.047 |
| 1363.460938 | -23.077 |
| 1363.552002 | -23.826 |
| 1363.643066 | -21.954 |
| 1363.734253 | -25.118 |
| 1363.825317 | -25.397 |
| 1363.916504 | -23.423 |
| 1364.00769 | -22.682 |
| 1364.098877 | -23.193 |
| 1364.189941 | -23.281 |
| 1364.281128 | -25.652 |
| 1364.372314 | -23.427 |
| 1364.463501 | -23.751 |
| 1364.55481 | -23.605 |
| 1364.645996 | -26.861 |
| 1364.737183 | -25.187 |
| 1364.828491 | -23.474 |
| 1364.919678 | -25.353 |
| 1365.010986 | -25.671 |
| 1365.102295 | -24.137 |
| 1365.193604 | -27.347 |
| 1365.284912 | -26.643 |
| 1365.376221 | -27.15 |
| 1365.467529 | -29.327 |
| 1365.558838 | -30.391 |
| 1365.650269 | -26.24 |
| 1365.741699 | -26.34 |
| 1365.833008 | -28.773 |
| 1365.924438 | -31.437 |
| 1366.015869 | -29.919 |
| 1366.1073 | -26.154 |
| 1366.19873 | -29.892 |
| 1366.290161 | -25.355 |
| 1366.381592 | -27.306 |
| 1366.473022 | -25.859 |
| 1366.564575 | -30.768 |
| 1366.656006 | -27.058 |
| 1366.747559 | -28.31 |
| 1366.839111 | -28.264 |
| 1366.930542 | -27.421 |
| 1367.022095 | -29.665 |
| 1367.113647 | -27.562 |
| 1367.2052 | -24.216 |
| 1367.296753 | -28.812 |
| 1367.388428 | -27.459 |
| 1367.47998 | -27.676 |
| 1367.571655 | -25.665 |
| 1367.66333 | -24.676 |
| 1367.755005 | -26.004 |
| 1367.846558 | -26.935 |
| 1367.938232 | -24.792 |
| 1368.029907 | -24.017 |
| 1368.121582 | -23.774 |
| 1368.213379 | -24.411 |
| 1368.305054 | -29.041 |
| 1368.396729 | -24.486 |
| 1368.488525 | -24.66 |
| 1368.5802 | -27.303 |
| 1368.671997 | -24.065 |
| 1368.763794 | -25.487 |
| 1368.855591 | -23.727 |
| 1368.947388 | -26.07 |
| 1369.039185 | -26.753 |
| 1369.130981 | -26.013 |
| 1369.222778 | -25.762 |
| 1369.314697 | -25.756 |
| 1369.406494 | -26.829 |
| 1369.498535 | -28.274 |
| 1369.590332 | -26.778 |
| 1369.682251 | -27.162 |
| 1369.77417 | -24.741 |
| 1369.866089 | -27.329 |
| 1369.958008 | -28.149 |
| 1370.050049 | -31.575 |
| 1370.141968 | -27.583 |
| 1370.233887 | -29.676 |
| 1370.325928 | -31.117 |
| 1370.417847 | -33 |
| 1370.509888 | -31.179 |
| 1370.601929 | -27.434 |
| 1370.69397 | -29.202 |
| 1370.786011 | -26.088 |
| 1370.878052 | -35.828 |
| 1370.970093 | -27.348 |
| 1371.062256 | -30.564 |
| 1371.154297 | -26.869 |
| 1371.24646 | -29.215 |
| 1371.338501 | -28.89 |
| 1371.430786 | -27.18 |
| 1371.522827 | -28.258 |
| 1371.61499 | -27.15 |
| 1371.707153 | -28.175 |
| 1371.799438 | -24.189 |
| 1371.891602 | -32.846 |
| 1371.983765 | -25.298 |
| 1372.07605 | -35.345 |
| 1372.168213 | -28 |
| 1372.260498 | -27.414 |
| 1372.352783 | -27.382 |
| 1372.444946 | -27.944 |
| 1372.537231 | -28.737 |
| 1372.629517 | -34.245 |
| 1372.721924 | -27.375 |
| 1372.814209 | -28.385 |
| 1372.906494 | -26.521 |
| 1372.998901 | -31.99 |
| 1373.091187 | -30.526 |
| 1373.183594 | -33.051 |
| 1373.276001 | -30.253 |
| 1373.368408 | -29.836 |
| 1373.460815 | -28.352 |
| 1373.553223 | -34.334 |
| 1373.64563 | -30.128 |
| 1373.738159 | -33.06 |
| 1373.830566 | -30.747 |
| 1373.923096 | -31.032 |
| 1374.015503 | -28.262 |
| 1374.108032 | -28.381 |
| 1374.200562 | -26.865 |
| 1374.293091 | -30.462 |
| 1374.38562 | -30.459 |
| 1374.478149 | -26.516 |
| 1374.570679 | -39.027 |
| 1374.663208 | -25.852 |
| 1374.755859 | -27.728 |
| 1374.848389 | -37.004 |
| 1374.94104 | -26.239 |
| 1375.033569 | -35.22 |
| 1375.126221 | -27.459 |
| 1375.218994 | -25.063 |
| 1375.311646 | -31.889 |
| 1375.404297 | -30.723 |
| 1375.496948 | -29.484 |
| 1375.5896 | -28.904 |
| 1375.682373 | -26.071 |
| 1375.775024 | -29.096 |
| 1375.867798 | -28.539 |
| 1375.960571 | -27.604 |
| 1376.053345 | -35.098 |
| 1376.146118 | -32.272 |
| 1376.238892 | -24.744 |
| 1376.331665 | -28.552 |
| 1376.424438 | -29.336 |
| 1376.517212 | -36.884 |
| 1376.610107 | -27.998 |
| 1376.702881 | -30.645 |
| 1376.795776 | -29.104 |
| 1376.888672 | -33.075 |
| 1376.981567 | -26.679 |
| 1377.074463 | -26.296 |
| 1377.167358 | -26.832 |
| 1377.260254 | -28.969 |
| 1377.353271 | -26.745 |
| 1377.446167 | -30.285 |
| 1377.539185 | -25.614 |
| 1377.63208 | -27.28 |
| 1377.725098 | -30.425 |
| 1377.818115 | -24.551 |
| 1377.911133 | -27.918 |
| 1378.004028 | -30.787 |
| 1378.097168 | -26.828 |
| 1378.190186 | -27.704 |
| 1378.283203 | -27.503 |
| 1378.376221 | -25.558 |
| 1378.46936 | -29.48 |
| 1378.5625 | -26.134 |
| 1378.655518 | -27.994 |
| 1378.748657 | -27.065 |
| 1378.841797 | -25.619 |
| 1378.934937 | -25.511 |
| 1379.028198 | -25.983 |
| 1379.121338 | -25.258 |
| 1379.214478 | -32.381 |
| 1379.307739 | -28.171 |
| 1379.400879 | -27.047 |
| 1379.494141 | -24.841 |
| 1379.587402 | -27.06 |
| 1379.680664 | -30.992 |
| 1379.773926 | -27.947 |
| 1379.867188 | -24.741 |
| 1379.960449 | -29.529 |
| 1380.053711 | -27.89 |
| 1380.146973 | -37.321 |
| 1380.240356 | -26.627 |
| 1380.333618 | -27.27 |
| 1380.427002 | -27.509 |
| 1380.520386 | -32.329 |
| 1380.61377 | -27.866 |
| 1380.707153 | -27.15 |
| 1380.800537 | -28.47 |
| 1380.893921 | -29.5 |
| 1380.987427 | -28.979 |
| 1381.080811 | -26.327 |
| 1381.174316 | -25.1 |
| 1381.267822 | -25.73 |
| 1381.361206 | -26.516 |
| 1381.454712 | -25.609 |
| 1381.548218 | -24.987 |
| 1381.641724 | -27.523 |
| 1381.735229 | -26.135 |
| 1381.828735 | -24.551 |
| 1381.922363 | -25.09 |
| 1382.015869 | -25.13 |
| 1382.109497 | -26.713 |
| 1382.203003 | -24.878 |
| 1382.296631 | -28.48 |
| 1382.390259 | -24.602 |
| 1382.483887 | -26.941 |
| 1382.577515 | -24.278 |
| 1382.671143 | -27.065 |
| 1382.764771 | -27.861 |
| 1382.858521 | -30.918 |
| 1382.952271 | -30.68 |
| 1383.045898 | -29.321 |
| 1383.139648 | -27.565 |
| 1383.233398 | -25.753 |
| 1383.327148 | -27.932 |
| 1383.420898 | -26.914 |
| 1383.514648 | -26.279 |
| 1383.608398 | -28.008 |
| 1383.702148 | -25.521 |
| 1383.796021 | -24.672 |
| 1383.889771 | -28.972 |
| 1383.983643 | -25.708 |
| 1384.077515 | -26.973 |
| 1384.171265 | -26.463 |
| 1384.265137 | -23.699 |
| 1384.359009 | -25.321 |
| 1384.452881 | -28.712 |
| 1384.546875 | -28.898 |
| 1384.640747 | -28.729 |
| 1384.734619 | -30.251 |
| 1384.828735 | -26.134 |
| 1384.922607 | -29.172 |
| 1385.016602 | -31.333 |